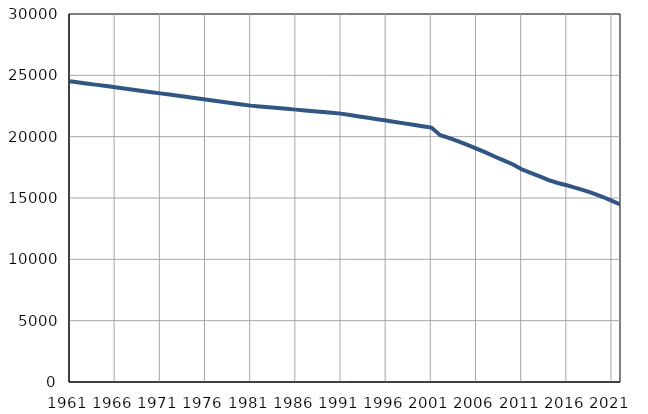
| Category | Population
size |
|---|---|
| 1961.0 | 24520 |
| 1962.0 | 24421 |
| 1963.0 | 24322 |
| 1964.0 | 24223 |
| 1965.0 | 24124 |
| 1966.0 | 24024 |
| 1967.0 | 23925 |
| 1968.0 | 23826 |
| 1969.0 | 23727 |
| 1970.0 | 23628 |
| 1971.0 | 23529 |
| 1972.0 | 23430 |
| 1973.0 | 23330 |
| 1974.0 | 23229 |
| 1975.0 | 23129 |
| 1976.0 | 23030 |
| 1977.0 | 22930 |
| 1978.0 | 22830 |
| 1979.0 | 22730 |
| 1980.0 | 22630 |
| 1981.0 | 22530 |
| 1982.0 | 22465 |
| 1983.0 | 22400 |
| 1984.0 | 22335 |
| 1985.0 | 22270 |
| 1986.0 | 22205 |
| 1987.0 | 22139 |
| 1988.0 | 22074 |
| 1989.0 | 22009 |
| 1990.0 | 21943 |
| 1991.0 | 21879 |
| 1992.0 | 21764 |
| 1993.0 | 21651 |
| 1994.0 | 21537 |
| 1995.0 | 21424 |
| 1996.0 | 21310 |
| 1997.0 | 21198 |
| 1998.0 | 21083 |
| 1999.0 | 20970 |
| 2000.0 | 20856 |
| 2001.0 | 20743 |
| 2002.0 | 20123 |
| 2003.0 | 19883 |
| 2004.0 | 19620 |
| 2005.0 | 19334 |
| 2006.0 | 19032 |
| 2007.0 | 18722 |
| 2008.0 | 18381 |
| 2009.0 | 18071 |
| 2010.0 | 17751 |
| 2011.0 | 17344 |
| 2012.0 | 17046 |
| 2013.0 | 16760 |
| 2014.0 | 16459 |
| 2015.0 | 16226 |
| 2016.0 | 16038 |
| 2017.0 | 15825 |
| 2018.0 | 15602 |
| 2019.0 | 15358 |
| 2020.0 | 15079 |
| 2021.0 | 14759 |
| 2022.0 | 14450 |